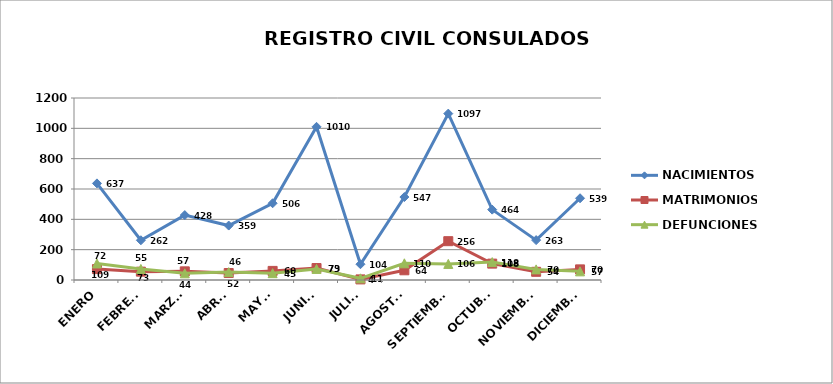
| Category | NACIMIENTOS | MATRIMONIOS | DEFUNCIONES |
|---|---|---|---|
| ENERO | 637 | 72 | 109 |
| FEBRERO | 262 | 55 | 73 |
| MARZO | 428 | 57 | 44 |
| ABRIL | 359 | 46 | 52 |
| MAYO | 506 | 60 | 45 |
| JUNIO | 1010 | 79 | 73 |
| JULIO | 104 | 4 | 11 |
| AGOSTO | 547 | 64 | 110 |
| SEPTIEMBRE | 1097 | 256 | 106 |
| OCTUBRE | 464 | 108 | 118 |
| NOVIEMBRE | 263 | 54 | 70 |
| DICIEMBRE | 539 | 70 | 57 |